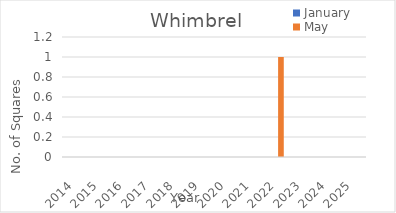
| Category | January | May |
|---|---|---|
| 2014.0 | 0 | 0 |
| 2015.0 | 0 | 0 |
| 2016.0 | 0 | 0 |
| 2017.0 | 0 | 0 |
| 2018.0 | 0 | 0 |
| 2019.0 | 0 | 0 |
| 2020.0 | 0 | 0 |
| 2021.0 | 0 | 0 |
| 2022.0 | 0 | 1 |
| 2023.0 | 0 | 0 |
| 2024.0 | 0 | 0 |
| 2025.0 | 0 | 0 |